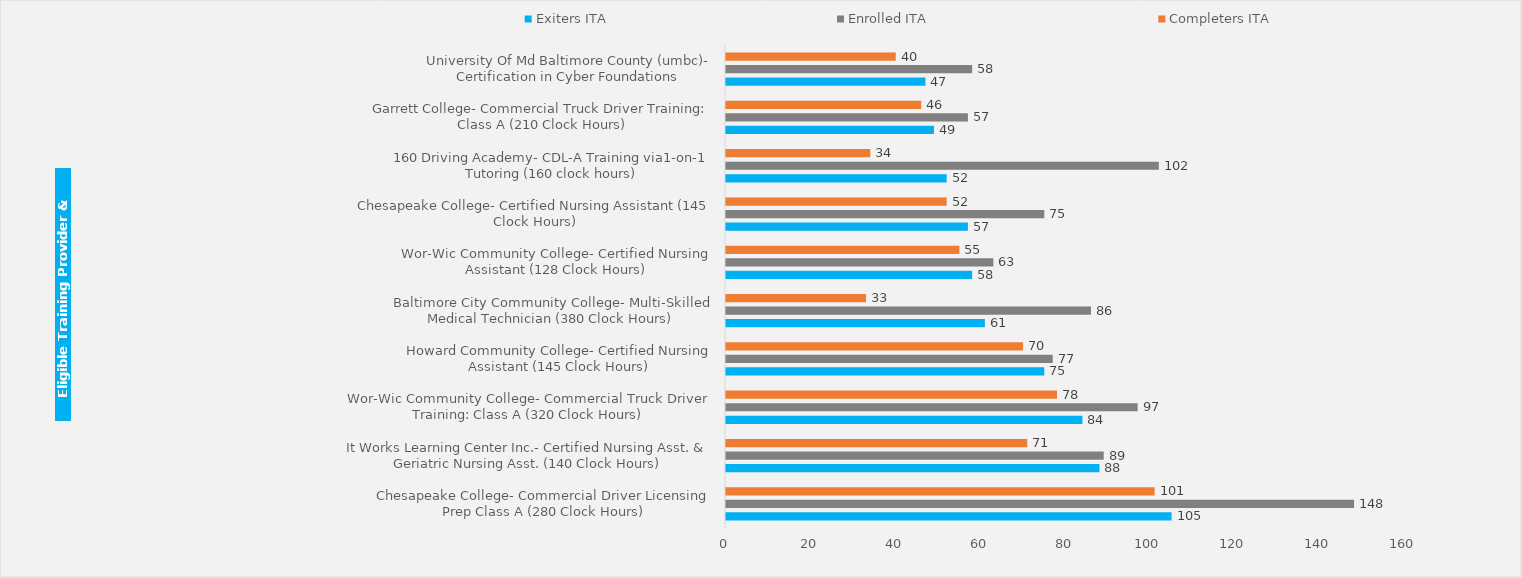
| Category | Exiters ITA | Enrolled ITA | Completers ITA |
|---|---|---|---|
| Chesapeake College- Commercial Driver Licensing Prep Class A (280 Clock Hours) | 105 | 148 | 101 |
| It Works Learning Center Inc.- Certified Nursing Asst. & Geriatric Nursing Asst. (140 Clock Hours) | 88 | 89 | 71 |
| Wor-Wic Community College- Commercial Truck Driver Training: Class A (320 Clock Hours) | 84 | 97 | 78 |
| Howard Community College- Certified Nursing Assistant (145 Clock Hours) | 75 | 77 | 70 |
| Baltimore City Community College- Multi-Skilled Medical Technician (380 Clock Hours) | 61 | 86 | 33 |
| Wor-Wic Community College- Certified Nursing Assistant (128 Clock Hours) | 58 | 63 | 55 |
| Chesapeake College- Certified Nursing Assistant (145 Clock Hours) | 57 | 75 | 52 |
| 160 Driving Academy- CDL-A Training via1-on-1 Tutoring (160 clock hours) | 52 | 102 | 34 |
| Garrett College- Commercial Truck Driver Training: Class A (210 Clock Hours) | 49 | 57 | 46 |
| University Of Md Baltimore County (umbc)- Certification in Cyber Foundations, Exam Prep (126 Clock Hours) | 47 | 58 | 40 |